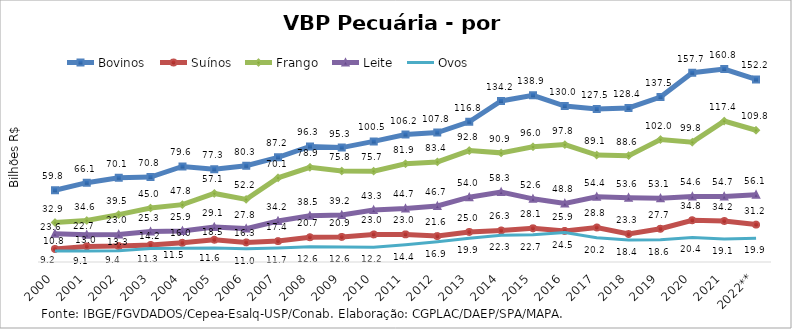
| Category | Bovinos | Suínos | Frango | Leite | Ovos |
|---|---|---|---|---|---|
| 2000 | 59.79 | 10.826 | 32.9 | 23.616 | 9.234 |
| 2001 | 66.092 | 12.988 | 34.58 | 22.726 | 9.099 |
| 2002 | 70.137 | 13.312 | 39.472 | 23.012 | 9.375 |
| 2003 | 70.786 | 14.227 | 45.002 | 25.341 | 11.34 |
| 2004 | 79.643 | 15.995 | 47.786 | 25.899 | 11.493 |
| 2005 | 77.322 | 18.545 | 57.131 | 29.13 | 11.571 |
| 2006 | 80.279 | 16.313 | 52.192 | 27.824 | 10.992 |
| 2007 | 87.245 | 17.444 | 70.125 | 34.205 | 11.682 |
| 2008 | 96.328 | 20.655 | 78.938 | 38.479 | 12.616 |
| 2009 | 95.324 | 20.879 | 75.791 | 39.23 | 12.579 |
| 2010 | 100.5 | 22.969 | 75.7 | 43.324 | 12.235 |
| 2011 | 106.244 | 23.005 | 81.873 | 44.661 | 14.416 |
| 2012 | 107.828 | 21.601 | 83.401 | 46.67 | 16.9 |
| 2013 | 116.847 | 25.011 | 92.826 | 54.006 | 19.876 |
| 2014 | 134.236 | 26.269 | 90.949 | 58.319 | 22.332 |
| 2015 | 138.856 | 28.074 | 96.013 | 52.643 | 22.738 |
| 2016 | 129.975 | 25.908 | 97.831 | 48.847 | 24.513 |
| 2017 | 127.548 | 28.76 | 89.107 | 54.425 | 20.205 |
| 2018 | 128.403 | 23.292 | 88.621 | 53.616 | 18.374 |
| 2019 | 137.492 | 27.685 | 102.038 | 53.119 | 18.608 |
| 2020 | 157.711 | 34.8 | 99.831 | 54.614 | 20.435 |
| 2021 | 160.824 | 34.18 | 117.441 | 54.674 | 19.15 |
| 2022** | 152.153 | 31.189 | 109.794 | 56.124 | 19.892 |